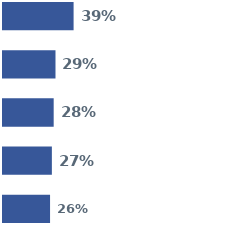
| Category | Series 0 | Series 1 | Series 2 | Series 3 | Series 4 |
|---|---|---|---|---|---|
| 0 | 0.39 | 0.29 | 0.28 | 0.27 | 0.26 |